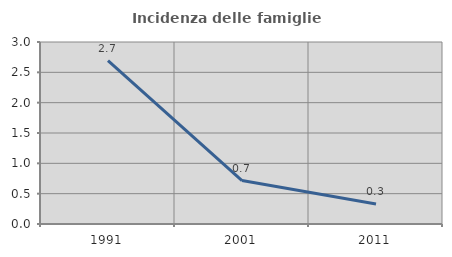
| Category | Incidenza delle famiglie numerose |
|---|---|
| 1991.0 | 2.694 |
| 2001.0 | 0.717 |
| 2011.0 | 0.33 |